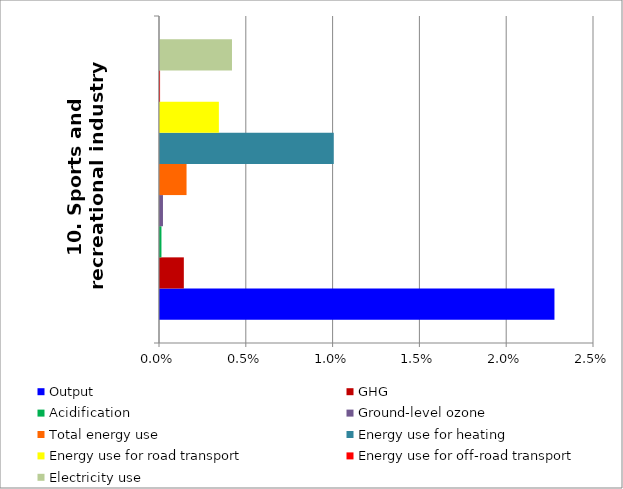
| Category | Output | GHG | Acidification | Ground-level ozone | Total energy use | Energy use for heating | Energy use for road transport | Energy use for off-road transport | Electricity use |
|---|---|---|---|---|---|---|---|---|---|
| 10. Sports and recreational industry | 0.023 | 0.001 | 0 | 0 | 0.002 | 0.01 | 0.003 | 0 | 0.004 |